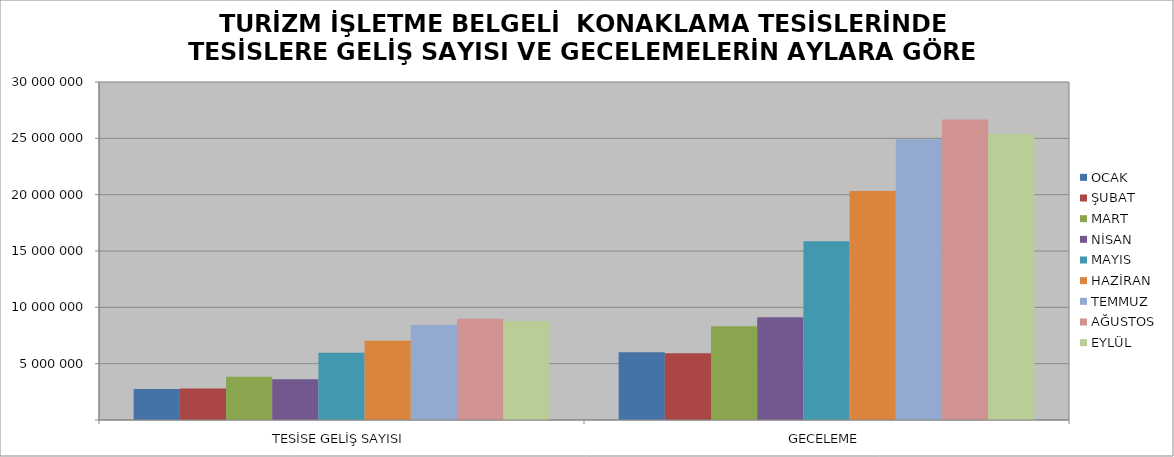
| Category | OCAK | ŞUBAT | MART | NİSAN | MAYIS | HAZİRAN | TEMMUZ | AĞUSTOS | EYLÜL |
|---|---|---|---|---|---|---|---|---|---|
| TESİSE GELİŞ SAYISI | 2752012 | 2800059 | 3828458 | 3612924 | 5975439 | 7040520 | 8433434 | 8994064 | 8797368 |
| GECELEME | 6020345 | 5929648 | 8312048 | 9130051 | 15857894 | 20320271 | 24913644 | 26662869 | 25388839 |